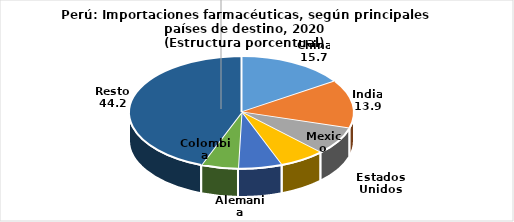
| Category | Series 0 |
|---|---|
| China | 15.663 |
| India | 13.946 |
| Estados Unidos | 8.044 |
| Mexico | 6.558 |
| Alemania | 6.286 |
| Colombia | 5.323 |
| Resto | 44.179 |